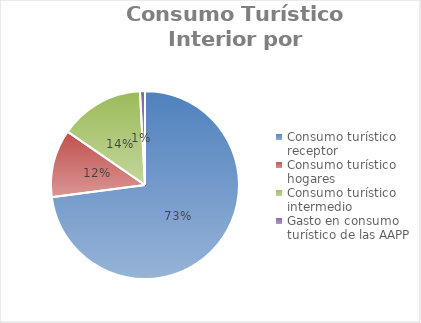
| Category | Series 0 |
|---|---|
| Consumo turístico receptor  | 7349507.617 |
| Consumo turístico hogares | 1176196.398 |
| Consumo turístico intermedio | 1464479.995 |
| Gasto en consumo turístico de las AAPP | 87047.335 |